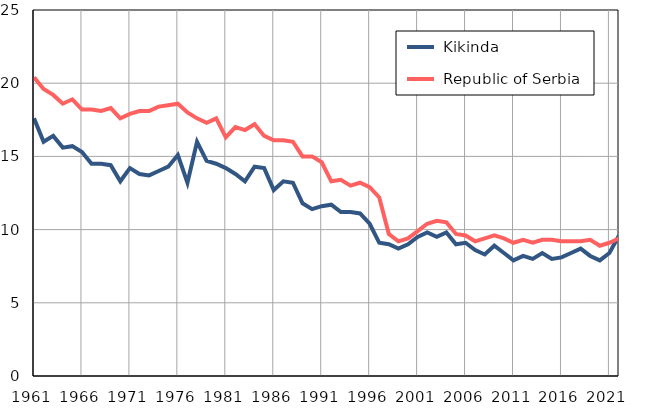
| Category |  Kikinda |  Republic of Serbia |
|---|---|---|
| 1961.0 | 17.6 | 20.4 |
| 1962.0 | 16 | 19.6 |
| 1963.0 | 16.4 | 19.2 |
| 1964.0 | 15.6 | 18.6 |
| 1965.0 | 15.7 | 18.9 |
| 1966.0 | 15.3 | 18.2 |
| 1967.0 | 14.5 | 18.2 |
| 1968.0 | 14.5 | 18.1 |
| 1969.0 | 14.4 | 18.3 |
| 1970.0 | 13.3 | 17.6 |
| 1971.0 | 14.2 | 17.9 |
| 1972.0 | 13.8 | 18.1 |
| 1973.0 | 13.7 | 18.1 |
| 1974.0 | 14 | 18.4 |
| 1975.0 | 14.3 | 18.5 |
| 1976.0 | 15.1 | 18.6 |
| 1977.0 | 13.2 | 18 |
| 1978.0 | 16 | 17.6 |
| 1979.0 | 14.7 | 17.3 |
| 1980.0 | 14.5 | 17.6 |
| 1981.0 | 14.2 | 16.3 |
| 1982.0 | 13.8 | 17 |
| 1983.0 | 13.3 | 16.8 |
| 1984.0 | 14.3 | 17.2 |
| 1985.0 | 14.2 | 16.4 |
| 1986.0 | 12.7 | 16.1 |
| 1987.0 | 13.3 | 16.1 |
| 1988.0 | 13.2 | 16 |
| 1989.0 | 11.8 | 15 |
| 1990.0 | 11.4 | 15 |
| 1991.0 | 11.6 | 14.6 |
| 1992.0 | 11.7 | 13.3 |
| 1993.0 | 11.2 | 13.4 |
| 1994.0 | 11.2 | 13 |
| 1995.0 | 11.1 | 13.2 |
| 1996.0 | 10.4 | 12.9 |
| 1997.0 | 9.1 | 12.2 |
| 1998.0 | 9 | 9.7 |
| 1999.0 | 8.7 | 9.2 |
| 2000.0 | 9 | 9.4 |
| 2001.0 | 9.5 | 9.9 |
| 2002.0 | 9.8 | 10.4 |
| 2003.0 | 9.5 | 10.6 |
| 2004.0 | 9.8 | 10.5 |
| 2005.0 | 9 | 9.7 |
| 2006.0 | 9.1 | 9.6 |
| 2007.0 | 8.6 | 9.2 |
| 2008.0 | 8.3 | 9.4 |
| 2009.0 | 8.9 | 9.6 |
| 2010.0 | 8.4 | 9.4 |
| 2011.0 | 7.9 | 9.1 |
| 2012.0 | 8.2 | 9.3 |
| 2013.0 | 8 | 9.1 |
| 2014.0 | 8.4 | 9.3 |
| 2015.0 | 8 | 9.3 |
| 2016.0 | 8.1 | 9.2 |
| 2017.0 | 8.4 | 9.2 |
| 2018.0 | 8.7 | 9.2 |
| 2019.0 | 8.2 | 9.3 |
| 2020.0 | 7.9 | 8.9 |
| 2021.0 | 8.4 | 9.1 |
| 2022.0 | 9.6 | 9.4 |